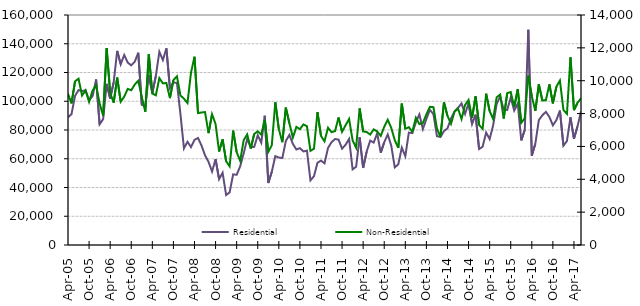
| Category | Residential |
|---|---|
| 2005-04-01 | 88840 |
| 2005-05-01 | 91030 |
| 2005-06-01 | 103700 |
| 2005-07-01 | 107770 |
| 2005-08-01 | 107040 |
| 2005-09-01 | 107710 |
| 2005-10-01 | 100650 |
| 2005-11-01 | 103570 |
| 2005-12-01 | 115150 |
| 2006-01-01 | 83980 |
| 2006-02-01 | 87550 |
| 2006-03-01 | 112090 |
| 2006-04-01 | 101830 |
| 2006-05-01 | 113160 |
| 2006-06-01 | 135030 |
| 2006-07-01 | 125720 |
| 2006-08-01 | 132180 |
| 2006-09-01 | 126890 |
| 2006-10-01 | 124980 |
| 2006-11-01 | 127530 |
| 2006-12-01 | 133770 |
| 2007-01-01 | 97580 |
| 2007-02-01 | 96560 |
| 2007-03-01 | 117970 |
| 2007-04-01 | 105780 |
| 2007-05-01 | 117560 |
| 2007-06-01 | 134370 |
| 2007-07-01 | 128660 |
| 2007-08-01 | 136790 |
| 2007-09-01 | 109250 |
| 2007-10-01 | 113080 |
| 2007-11-01 | 112770 |
| 2007-12-01 | 91140 |
| 2008-01-01 | 67220 |
| 2008-02-01 | 71820 |
| 2008-03-01 | 68100 |
| 2008-04-01 | 73130 |
| 2008-05-01 | 74470 |
| 2008-06-01 | 69150 |
| 2008-07-01 | 62400 |
| 2008-08-01 | 57810 |
| 2008-09-01 | 51080 |
| 2008-10-01 | 59710 |
| 2008-11-01 | 45780 |
| 2008-12-01 | 50260 |
| 2009-01-01 | 34750 |
| 2009-02-01 | 36580 |
| 2009-03-01 | 49130 |
| 2009-04-01 | 48840 |
| 2009-05-01 | 54720 |
| 2009-06-01 | 63710 |
| 2009-07-01 | 73760 |
| 2009-08-01 | 68080 |
| 2009-09-01 | 68260 |
| 2009-10-01 | 76320 |
| 2009-11-01 | 71150 |
| 2009-12-01 | 89920 |
| 2010-01-01 | 43110 |
| 2010-02-01 | 50920 |
| 2010-03-01 | 61810 |
| 2010-04-01 | 60830 |
| 2010-05-01 | 60500 |
| 2010-06-01 | 72370 |
| 2010-07-01 | 76590 |
| 2010-08-01 | 70320 |
| 2010-09-01 | 66440 |
| 2010-10-01 | 67380 |
| 2010-11-01 | 65080 |
| 2010-12-01 | 65650 |
| 2011-01-01 | 44970 |
| 2011-02-01 | 47830 |
| 2011-03-01 | 57200 |
| 2011-04-01 | 58700 |
| 2011-05-01 | 56820 |
| 2011-06-01 | 67500 |
| 2011-07-01 | 71550 |
| 2011-08-01 | 73720 |
| 2011-09-01 | 73310 |
| 2011-10-01 | 67030 |
| 2011-11-01 | 69730 |
| 2011-12-01 | 73780 |
| 2012-01-01 | 52630 |
| 2012-02-01 | 54440 |
| 2012-03-01 | 74960 |
| 2012-04-01 | 53590 |
| 2012-05-01 | 64960 |
| 2012-06-01 | 72590 |
| 2012-07-01 | 71240 |
| 2012-08-01 | 77690 |
| 2012-09-01 | 64200 |
| 2012-10-01 | 71490 |
| 2012-11-01 | 76910 |
| 2012-12-01 | 69100 |
| 2013-01-01 | 53990 |
| 2013-02-01 | 56120 |
| 2013-03-01 | 67740 |
| 2013-04-01 | 61780 |
| 2013-05-01 | 78170 |
| 2013-06-01 | 77850 |
| 2013-07-01 | 85310 |
| 2013-08-01 | 90850 |
| 2013-09-01 | 80640 |
| 2013-10-01 | 87730 |
| 2013-11-01 | 94020 |
| 2013-12-01 | 91030 |
| 2014-01-01 | 75750 |
| 2014-02-01 | 75100 |
| 2014-03-01 | 79280 |
| 2014-04-01 | 81140 |
| 2014-05-01 | 87930 |
| 2014-06-01 | 92950 |
| 2014-07-01 | 95430 |
| 2014-08-01 | 98450 |
| 2014-09-01 | 91170 |
| 2014-10-01 | 98630 |
| 2014-11-01 | 84150 |
| 2014-12-01 | 90650 |
| 2015-01-01 | 66750 |
| 2015-02-01 | 68390 |
| 2015-03-01 | 78240 |
| 2015-04-01 | 73690 |
| 2015-05-01 | 83310 |
| 2015-06-01 | 98200 |
| 2015-07-01 | 103160 |
| 2015-08-01 | 94260 |
| 2015-09-01 | 93940 |
| 2015-10-01 | 102540 |
| 2015-11-01 | 93490 |
| 2015-12-01 | 98400 |
| 2016-01-01 | 72750 |
| 2016-02-01 | 80110 |
| 2016-03-01 | 149710 |
| 2016-04-01 | 62150 |
| 2016-05-01 | 70490 |
| 2016-06-01 | 86860 |
| 2016-07-01 | 90220 |
| 2016-08-01 | 92650 |
| 2016-09-01 | 89100 |
| 2016-10-01 | 83250 |
| 2016-11-01 | 86920 |
| 2016-12-01 | 93540 |
| 2017-01-01 | 69090 |
| 2017-02-01 | 72360 |
| 2017-03-01 | 88780 |
| 2017-04-01 | 73900 |
| 2017-05-01 | 82480 |
| 2017-06-01 | 92910 |